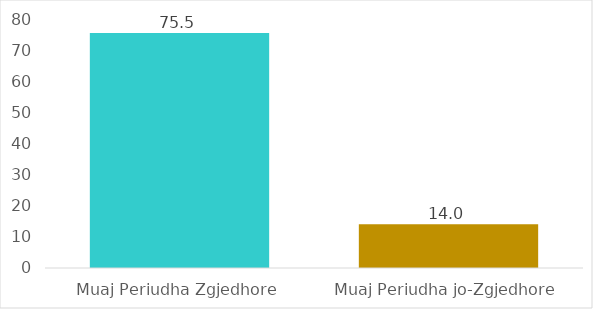
| Category | Mesatarisht Pagesa për Muaj |
|---|---|
| Muaj Periudha Zgjedhore | 75.522 |
| Muaj Periudha jo-Zgjedhore | 14.036 |